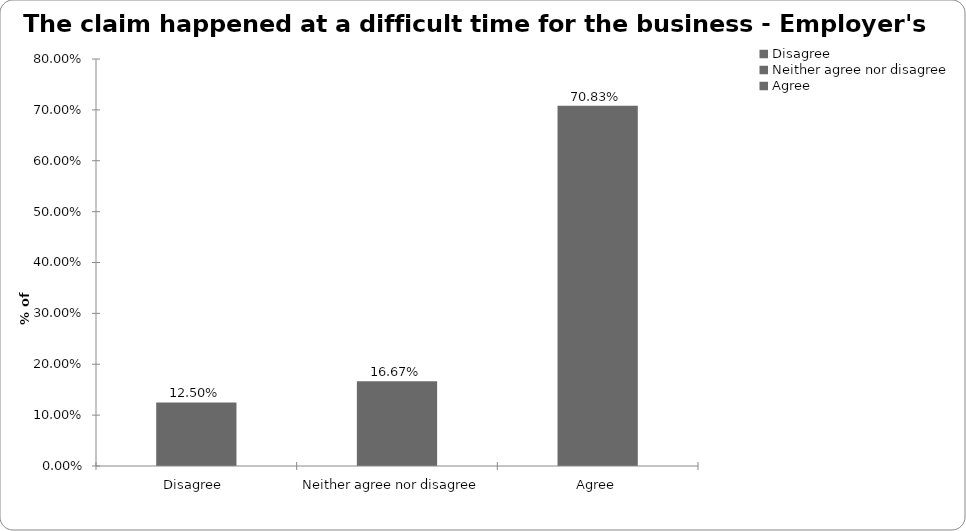
| Category | Employer's liability |
|---|---|
| Disagree  | 0.125 |
| Neither agree nor disagree  | 0.167 |
| Agree | 0.708 |